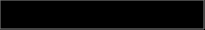
| Category | Series 0 |
|---|---|
| 0 | 0.117 |
| 1 | 0.747 |
| 2 | 0.137 |